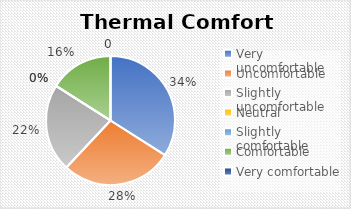
| Category | Series 0 |
|---|---|
| Very uncomfortable | 0.34 |
| Uncomfortable | 0.28 |
| Slightly uncomfortable | 0.22 |
| Neutral | 0 |
| Slightly comfortable | 0 |
| Comfortable | 0.16 |
| Very comfortable | 0 |